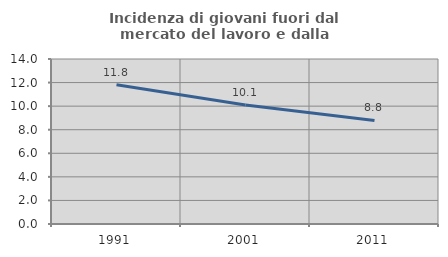
| Category | Incidenza di giovani fuori dal mercato del lavoro e dalla formazione  |
|---|---|
| 1991.0 | 11.823 |
| 2001.0 | 10.101 |
| 2011.0 | 8.791 |